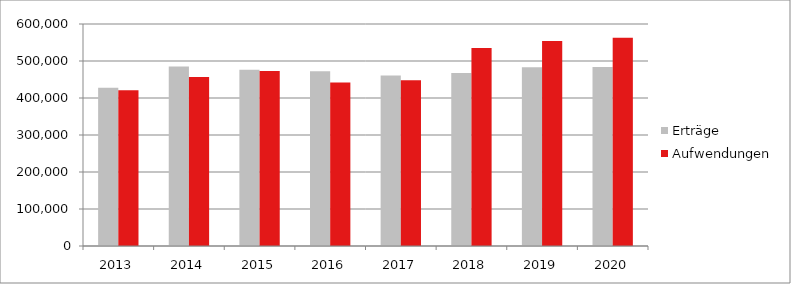
| Category | Erträge | Aufwendungen |
|---|---|---|
| 2013.0 | 427517 | 420685 |
| 2014.0 | 484843 | 457021 |
| 2015.0 | 476124 | 472846 |
| 2016.0 | 472566 | 441979 |
| 2017.0 | 460588 | 447730 |
| 2018.0 | 467414 | 534931 |
| 2019.0 | 482875 | 554309 |
| 2020.0 | 483763 | 563014 |